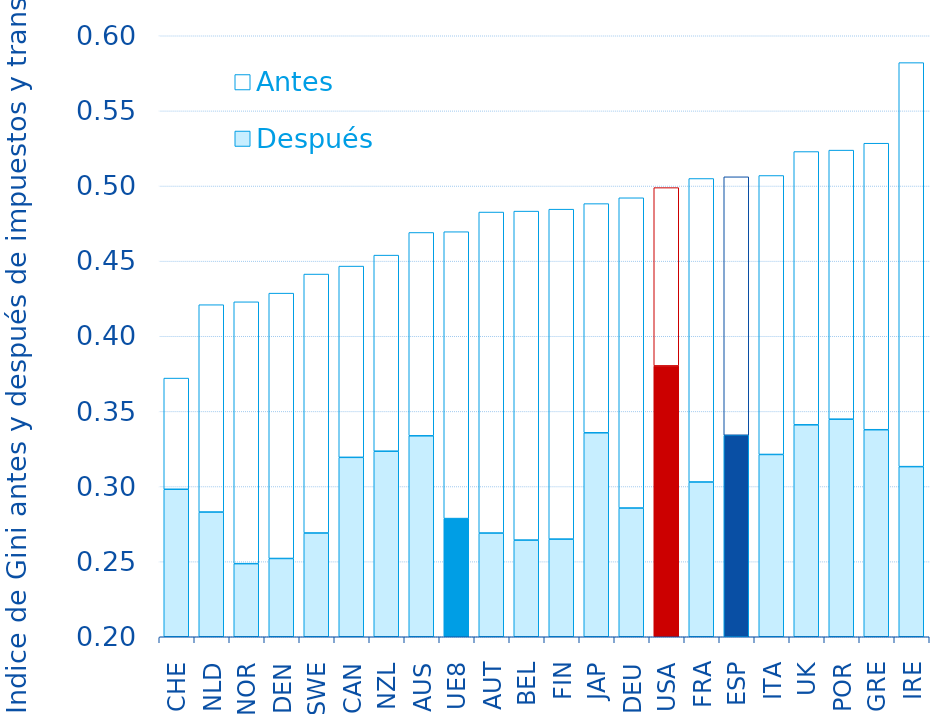
| Category |  Después |  Antes |
|---|---|---|
| CHE | 0.298 | 0.074 |
| NLD | 0.283 | 0.138 |
| NOR | 0.249 | 0.174 |
| DEN | 0.252 | 0.177 |
| SWE | 0.269 | 0.172 |
| CAN | 0.319 | 0.127 |
| NZL | 0.324 | 0.13 |
| AUS | 0.334 | 0.135 |
| UE8 | 0.279 | 0.191 |
| AUT | 0.269 | 0.214 |
| BEL | 0.264 | 0.219 |
| FIN | 0.265 | 0.22 |
| JAP | 0.336 | 0.153 |
| DEU | 0.286 | 0.206 |
| USA | 0.38 | 0.119 |
| FRA | 0.303 | 0.202 |
| ESP | 0.334 | 0.172 |
| ITA | 0.321 | 0.186 |
| UK | 0.341 | 0.182 |
| POR | 0.345 | 0.179 |
| GRE | 0.338 | 0.191 |
| IRE | 0.313 | 0.269 |